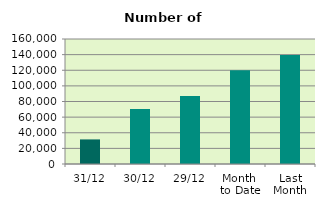
| Category | Series 0 |
|---|---|
| 31/12 | 31466 |
| 30/12 | 70560 |
| 29/12 | 87168 |
| Month 
to Date | 120108.783 |
| Last
Month | 139642.182 |